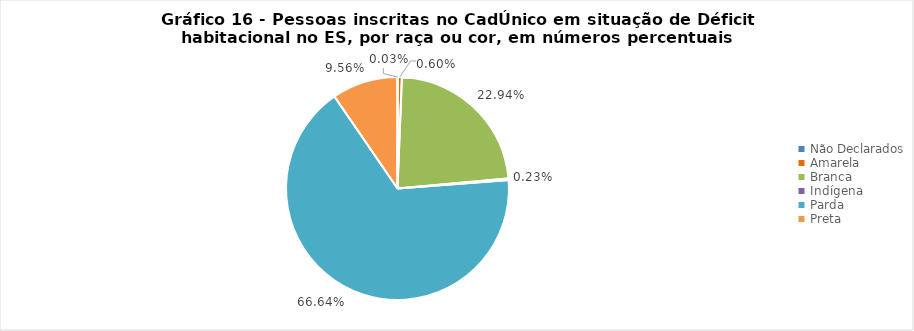
| Category | Series 0 |
|---|---|
| Não Declarados | 0 |
| Amarela | 0.006 |
| Branca | 0.229 |
| Indígena | 0.002 |
| Parda | 0.666 |
| Preta | 0.096 |